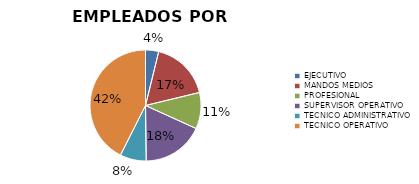
| Category | Series 0 |
|---|---|
| EJECUTIVO | 106 |
| MANDOS MEDIOS | 482 |
| PROFESIONAL | 293 |
| SUPERVISOR OPERATIVO | 498 |
| TECNICO ADMINISTRATIVO | 212 |
| TECNICO OPERATIVO | 1179 |